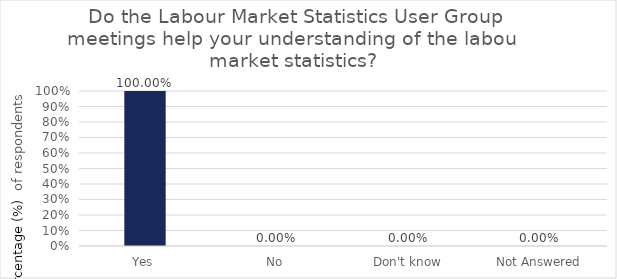
| Category | Series 0 |
|---|---|
| Yes | 1 |
| No | 0 |
| Don't know | 0 |
| Not Answered | 0 |